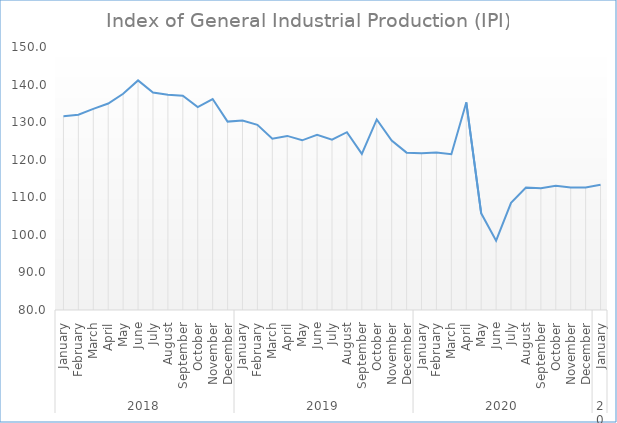
| Category | Series 0 |
|---|---|
| 0 | 131.554 |
| 1 | 131.978 |
| 2 | 133.541 |
| 3 | 134.948 |
| 4 | 137.543 |
| 5 | 141.109 |
| 6 | 137.87 |
| 7 | 137.31 |
| 8 | 137.024 |
| 9 | 134 |
| 10 | 136.149 |
| 11 | 130.141 |
| 12 | 130.427 |
| 13 | 129.292 |
| 14 | 125.577 |
| 15 | 126.337 |
| 16 | 125.162 |
| 17 | 126.607 |
| 18 | 125.321 |
| 19 | 127.328 |
| 20 | 121.554 |
| 21 | 130.711 |
| 22 | 125.115 |
| 23 | 121.882 |
| 24 | 121.717 |
| 25 | 121.895 |
| 26 | 121.451 |
| 27 | 135.238 |
| 28 | 105.732 |
| 29 | 98.453 |
| 30 | 108.518 |
| 31 | 112.576 |
| 32 | 112.408 |
| 33 | 113.06 |
| 34 | 112.598 |
| 35 | 112.623 |
| 36 | 113.334 |